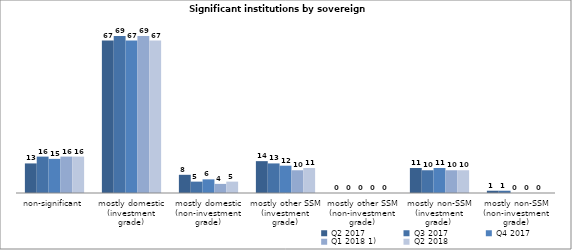
| Category | Q2 2017 | Q3 2017 | Q4 2017 | Q1 2018 1) | Q2 2018 |
|---|---|---|---|---|---|
| non-significant | 13 | 16 | 15 | 16 | 16 |
| mostly domestic
(investment grade) | 67 | 69 | 67 | 69 | 67 |
| mostly domestic
(non-investment grade) | 8 | 5 | 6 | 4 | 5 |
| mostly other SSM
(investment grade) | 14 | 13 | 12 | 10 | 11 |
| mostly other SSM
(non-investment grade) | 0 | 0 | 0 | 0 | 0 |
| mostly non-SSM
(investment grade)  | 11 | 10 | 11 | 10 | 10 |
| mostly non-SSM
(non-investment grade) | 1 | 1 | 0 | 0 | 0 |